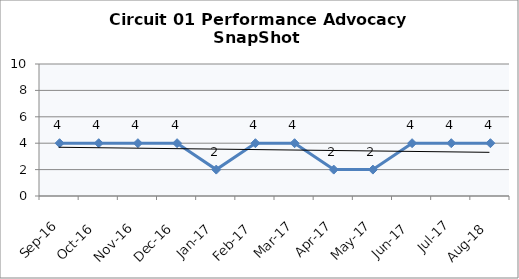
| Category | Circuit 01 |
|---|---|
| Sep-16 | 4 |
| Oct-16 | 4 |
| Nov-16 | 4 |
| Dec-16 | 4 |
| Jan-17 | 2 |
| Feb-17 | 4 |
| Mar-17 | 4 |
| Apr-17 | 2 |
| May-17 | 2 |
| Jun-17 | 4 |
| Jul-17 | 4 |
| Aug-18 | 4 |